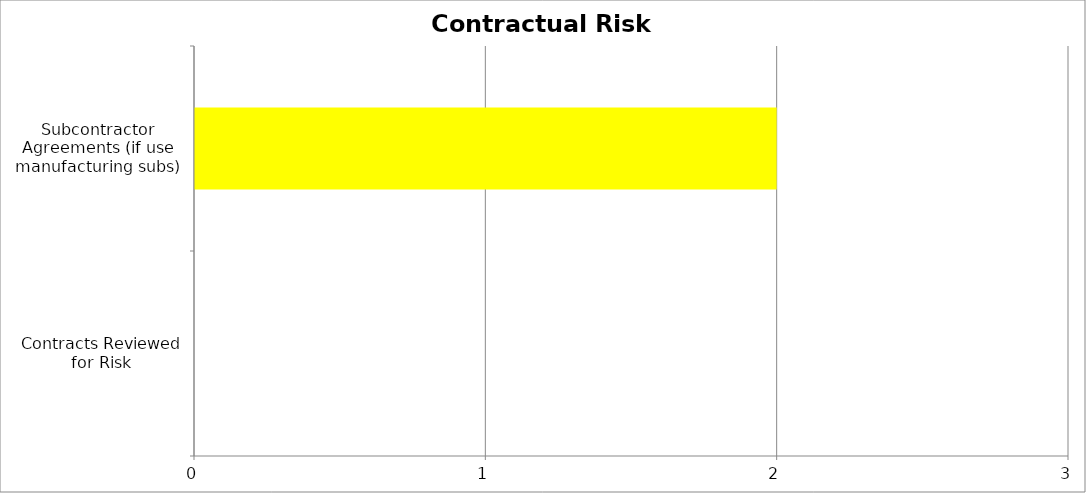
| Category | High | Medium | Low |
|---|---|---|---|
| Contracts Reviewed for Risk | 0 | 0 | 0 |
| Subcontractor Agreements (if use manufacturing subs) | 0 | 2 | 0 |